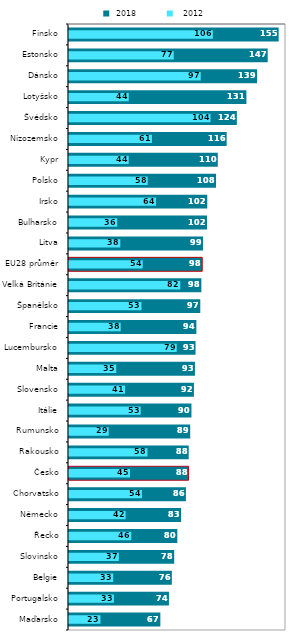
| Category |  2018 |
|---|---|
| Maďarsko | 67.353 |
| Portugalsko | 73.696 |
| Belgie | 75.834 |
| Slovinsko | 77.556 |
| Řecko | 79.865 |
| Německo | 82.667 |
| Chorvatsko | 86.208 |
| Česko | 88.112 |
| Rakousko | 88.267 |
| Rumunsko | 89.363 |
| Itálie | 90.285 |
| Slovensko | 92.112 |
| Malta | 92.857 |
| Lucembursko | 93.3 |
| Francie | 93.909 |
| Španělsko | 96.798 |
| Velká Británie | 97.589 |
| EU28 průměr | 98.215 |
| Litva | 98.802 |
| Bulharsko | 101.754 |
| Irsko | 101.944 |
| Polsko | 108.39 |
| Kypr | 109.716 |
| Nizozemsko | 116.24 |
| Švédsko | 123.759 |
| Lotyšsko | 130.806 |
| Dánsko | 138.696 |
| Estonsko | 146.505 |
| Finsko | 154.587 |